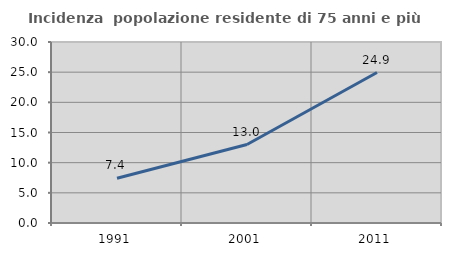
| Category | Incidenza  popolazione residente di 75 anni e più |
|---|---|
| 1991.0 | 7.428 |
| 2001.0 | 13.009 |
| 2011.0 | 24.936 |